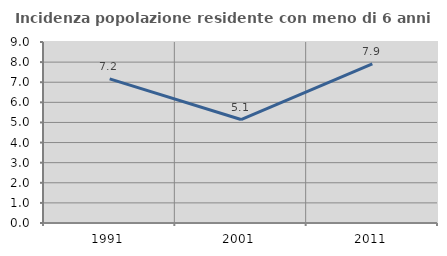
| Category | Incidenza popolazione residente con meno di 6 anni |
|---|---|
| 1991.0 | 7.165 |
| 2001.0 | 5.144 |
| 2011.0 | 7.908 |